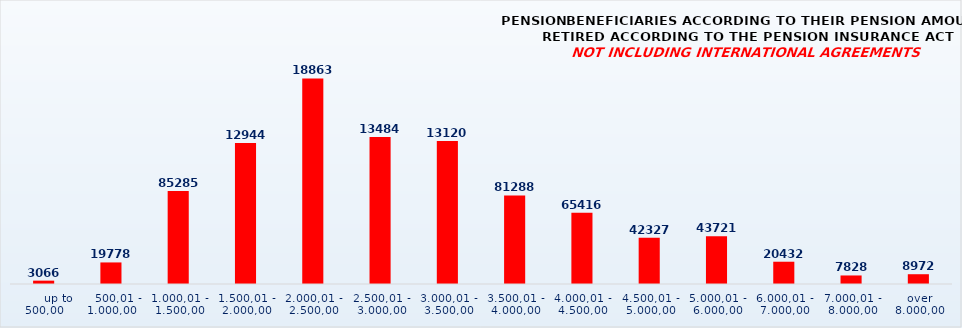
| Category | PENSION BENEFICIARIES ACCORDING TO TYPES AND AMOUNTS OF PENSION, RETIRED ACCORDING TO THE PENSION INSURANCE ACT
NOT INCLUDING INTERNATIONAL AGREEMENTS |
|---|---|
|       up to 500,00 | 3066 |
|    500,01 - 1.000,00 | 19778 |
| 1.000,01 - 1.500,00 | 85285 |
| 1.500,01 - 2.000,00 | 129441 |
| 2.000,01 - 2.500,00 | 188632 |
| 2.500,01 - 3.000,00 | 134848 |
| 3.000,01 - 3.500,00 | 131203 |
| 3.500,01 - 4.000,00 | 81288 |
| 4.000,01 - 4.500,00 | 65416 |
| 4.500,01 - 5.000,00 | 42327 |
| 5.000,01 - 6.000,00 | 43721 |
| 6.000,01 - 7.000,00 | 20432 |
| 7.000,01 - 8.000,00 | 7828 |
|  over  8.000,00 | 8972 |